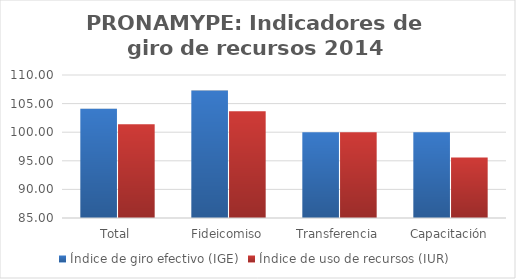
| Category | Índice de giro efectivo (IGE) | Índice de uso de recursos (IUR)  |
|---|---|---|
| Total | 104.079 | 101.373 |
| Fideicomiso | 107.278 | 103.667 |
| Transferencia | 100 | 100 |
| Capacitación | 100 | 95.589 |